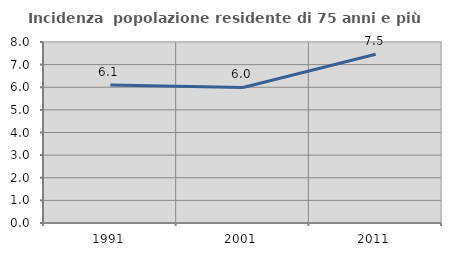
| Category | Incidenza  popolazione residente di 75 anni e più |
|---|---|
| 1991.0 | 6.1 |
| 2001.0 | 5.991 |
| 2011.0 | 7.456 |